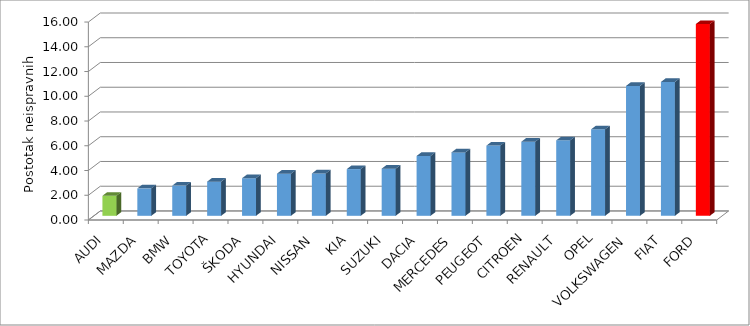
| Category | Series 4 |
|---|---|
| AUDI | 1.618 |
| MAZDA | 2.217 |
| BMW | 2.44 |
| TOYOTA | 2.762 |
| ŠKODA | 3.037 |
| HYUNDAI | 3.403 |
| NISSAN | 3.422 |
| KIA | 3.776 |
| SUZUKI | 3.812 |
| DACIA | 4.837 |
| MERCEDES | 5.126 |
| PEUGEOT | 5.672 |
| CITROEN | 5.989 |
| RENAULT | 6.098 |
| OPEL | 6.99 |
| VOLKSWAGEN | 10.499 |
| FIAT | 10.821 |
| FORD | 15.5 |